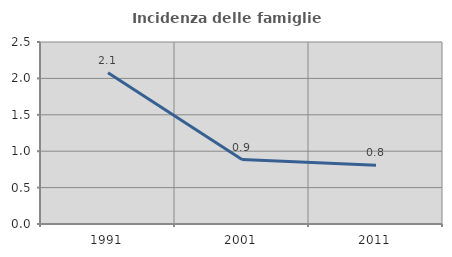
| Category | Incidenza delle famiglie numerose |
|---|---|
| 1991.0 | 2.079 |
| 2001.0 | 0.886 |
| 2011.0 | 0.807 |